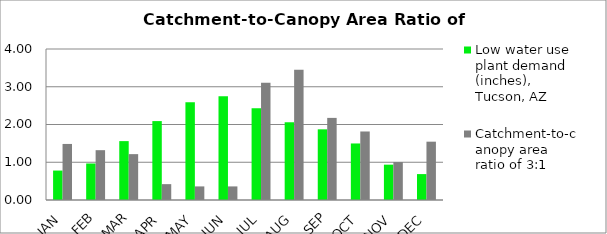
| Category | Low water use plant demand (inches), Tucson, AZ  | Catchment-to-canopy area ratio of 3:1  |
|---|---|---|
| JAN | 0.78 | 1.485 |
| FEB | 0.967 | 1.32 |
| MAR | 1.56 | 1.215 |
| APR | 2.09 | 0.42 |
| MAY | 2.59 | 0.36 |
| JUN | 2.746 | 0.36 |
| JUL | 2.434 | 3.105 |
| AUG | 2.059 | 3.45 |
| SEP | 1.872 | 2.175 |
| OCT | 1.498 | 1.815 |
| NOV | 0.936 | 1.005 |
| DEC | 0.686 | 1.545 |